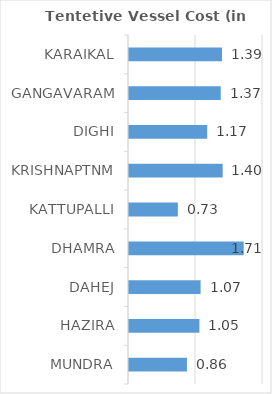
| Category | VRC |
|---|---|
| MUNDRA | 0.865 |
| HAZIRA | 1.051 |
| DAHEJ | 1.068 |
| DHAMRA | 1.712 |
| KATTUPALLI | 0.729 |
| KRISHNAPTNM | 1.398 |
| DIGHI | 1.167 |
| GANGAVARAM | 1.369 |
| KARAIKAL | 1.388 |